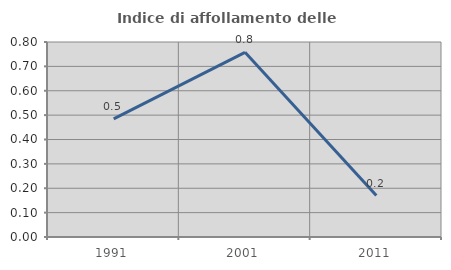
| Category | Indice di affollamento delle abitazioni  |
|---|---|
| 1991.0 | 0.484 |
| 2001.0 | 0.758 |
| 2011.0 | 0.17 |